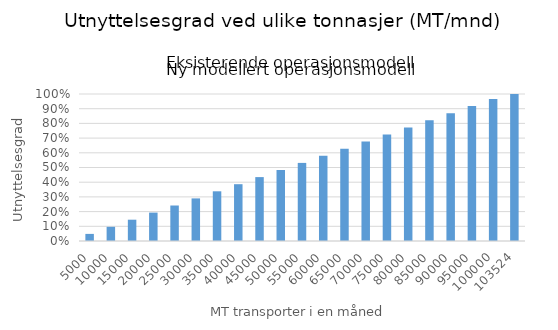
| Category | Utnyttelsesgrad |
|---|---|
| 5000.0 | 0.048 |
| 10000.0 | 0.097 |
| 15000.0 | 0.145 |
| 20000.0 | 0.193 |
| 25000.0 | 0.241 |
| 30000.0 | 0.29 |
| 35000.0 | 0.338 |
| 40000.0 | 0.386 |
| 45000.0 | 0.435 |
| 50000.0 | 0.483 |
| 55000.0 | 0.531 |
| 60000.0 | 0.58 |
| 65000.0 | 0.628 |
| 70000.0 | 0.676 |
| 75000.0 | 0.724 |
| 80000.0 | 0.773 |
| 85000.0 | 0.821 |
| 90000.0 | 0.869 |
| 95000.0 | 0.918 |
| 100000.0 | 0.966 |
| 103524.0 | 1 |